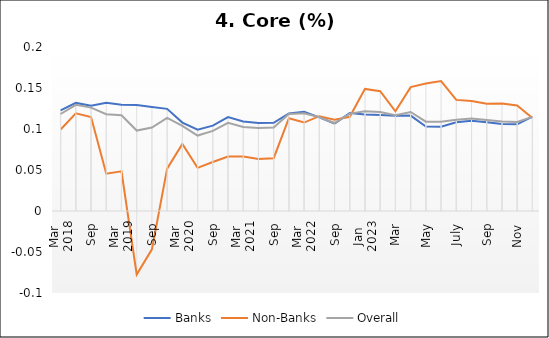
| Category | Banks | Non-Banks | Overall |
|---|---|---|---|
| 0 | 0.123 | 0.099 | 0.118 |
| 1 | 0.132 | 0.119 | 0.13 |
| 2 | 0.128 | 0.115 | 0.126 |
| 3 | 0.132 | 0.046 | 0.118 |
| 4 | 0.13 | 0.048 | 0.117 |
| 5 | 0.129 | -0.077 | 0.098 |
| 6 | 0.127 | -0.047 | 0.102 |
| 7 | 0.125 | 0.052 | 0.114 |
| 8 | 0.108 | 0.082 | 0.104 |
| 9 | 0.099 | 0.053 | 0.092 |
| 10 | 0.104 | 0.06 | 0.098 |
| 11 | 0.114 | 0.066 | 0.108 |
| 12 | 0.109 | 0.066 | 0.102 |
| 13 | 0.107 | 0.063 | 0.101 |
| 14 | 0.108 | 0.064 | 0.102 |
| 15 | 0.119 | 0.113 | 0.118 |
| 16 | 0.121 | 0.108 | 0.119 |
| 17 | 0.114 | 0.116 | 0.114 |
| 18 | 0.107 | 0.111 | 0.107 |
| 19 | 0.119 | 0.115 | 0.119 |
| 20 | 0.118 | 0.149 | 0.122 |
| 21 | 0.117 | 0.146 | 0.121 |
| 22 | 0.116 | 0.122 | 0.117 |
| 23 | 0.116 | 0.151 | 0.121 |
| 24 | 0.103 | 0.156 | 0.109 |
| 25 | 0.103 | 0.159 | 0.109 |
| 26 | 0.108 | 0.135 | 0.111 |
| 27 | 0.11 | 0.134 | 0.113 |
| 28 | 0.108 | 0.131 | 0.111 |
| 29 | 0.106 | 0.131 | 0.109 |
| 30 | 0.106 | 0.129 | 0.108 |
| 31 | 0.115 | 0.113 | 0.115 |